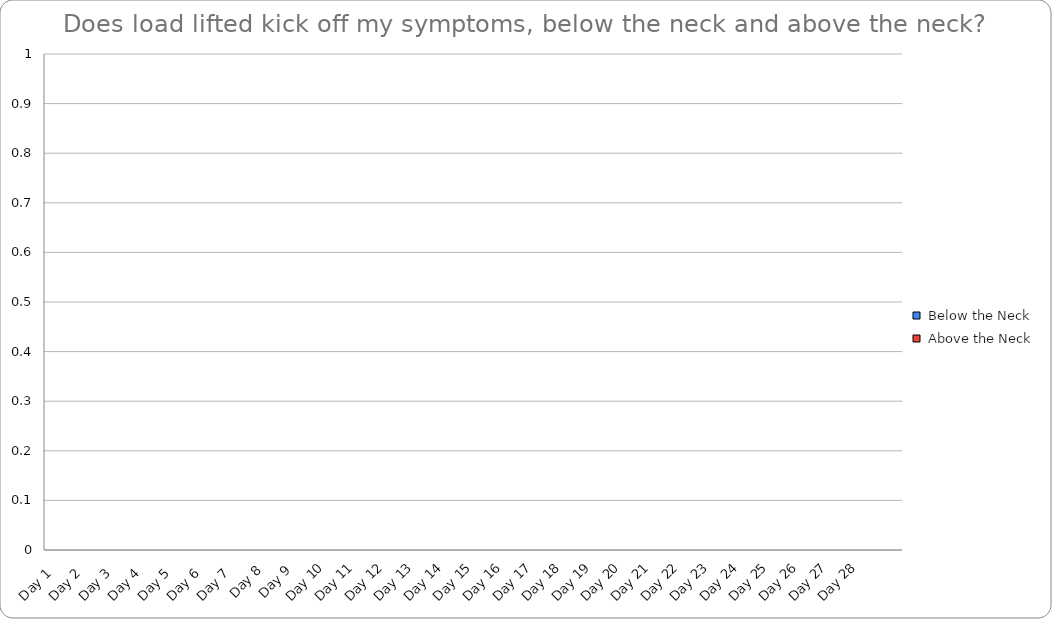
| Category | Below the Neck | Above the Neck |
|---|---|---|
| Day 1  | 0 | 0 |
| Day 2  | 0 | 0 |
| Day 3  | 0 | 0 |
| Day 4  | 0 | 0 |
| Day 5  | 0 | 0 |
| Day 6  | 0 | 0 |
| Day 7  | 0 | 0 |
| Day 8 | 0 | 0 |
| Day 9 | 0 | 0 |
| Day 10 | 0 | 0 |
| Day 11 | 0 | 0 |
| Day 12 | 0 | 0 |
| Day 13 | 0 | 0 |
| Day 14 | 0 | 0 |
| Day 15 | 0 | 0 |
| Day 16 | 0 | 0 |
| Day 17 | 0 | 0 |
| Day 18 | 0 | 0 |
| Day 19 | 0 | 0 |
| Day 20 | 0 | 0 |
| Day 21 | 0 | 0 |
| Day 22 | 0 | 0 |
| Day 23 | 0 | 0 |
| Day 24 | 0 | 0 |
| Day 25 | 0 | 0 |
| Day 26 | 0 | 0 |
| Day 27 | 0 | 0 |
| Day 28 | 0 | 0 |